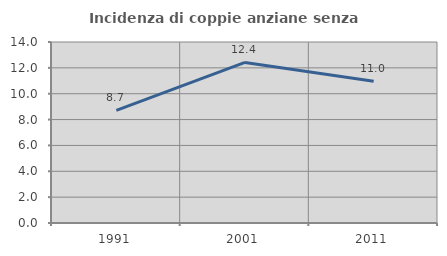
| Category | Incidenza di coppie anziane senza figli  |
|---|---|
| 1991.0 | 8.714 |
| 2001.0 | 12.421 |
| 2011.0 | 10.968 |